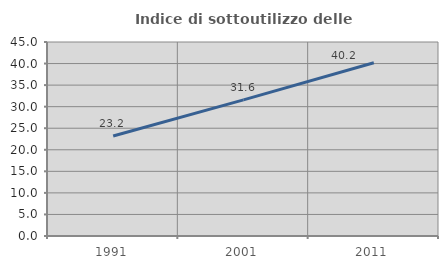
| Category | Indice di sottoutilizzo delle abitazioni  |
|---|---|
| 1991.0 | 23.184 |
| 2001.0 | 31.579 |
| 2011.0 | 40.173 |